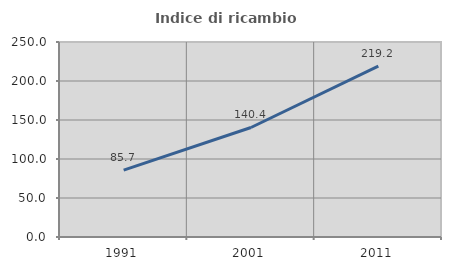
| Category | Indice di ricambio occupazionale  |
|---|---|
| 1991.0 | 85.654 |
| 2001.0 | 140.394 |
| 2011.0 | 219.186 |